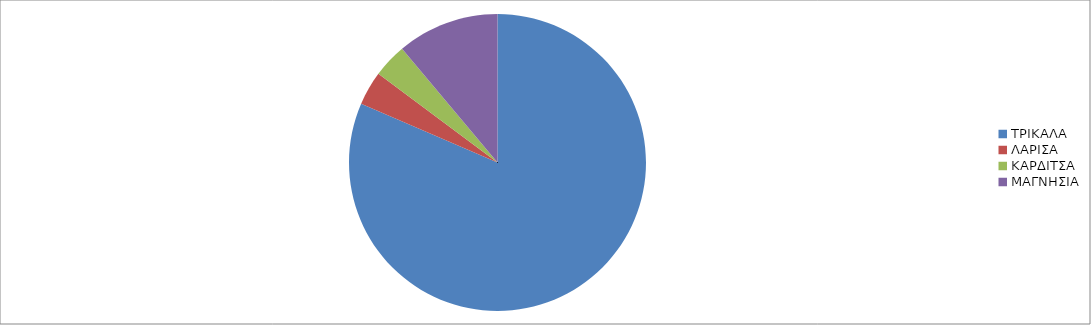
| Category | ΑΘΛΗΤΕΣ |
|---|---|
| ΤΡΙΚΑΛΑ | 22 |
| ΛΑΡΙΣΑ | 1 |
| ΚΑΡΔΙΤΣΑ | 1 |
| ΜΑΓΝΗΣΙΑ | 3 |